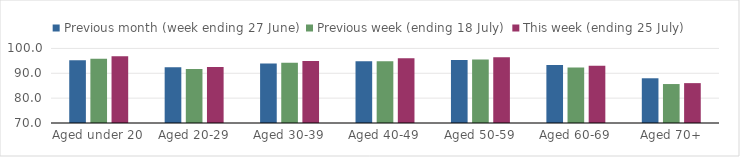
| Category | Previous month (week ending 27 June) | Previous week (ending 18 July) | This week (ending 25 July) |
|---|---|---|---|
| Aged under 20 | 95.215 | 95.848 | 96.891 |
| Aged 20-29 | 92.397 | 91.743 | 92.509 |
| Aged 30-39 | 93.985 | 94.232 | 94.952 |
| Aged 40-49 | 94.798 | 94.891 | 96.035 |
| Aged 50-59 | 95.38 | 95.515 | 96.453 |
| Aged 60-69 | 93.317 | 92.313 | 93.048 |
| Aged 70+ | 87.994 | 85.673 | 86.04 |